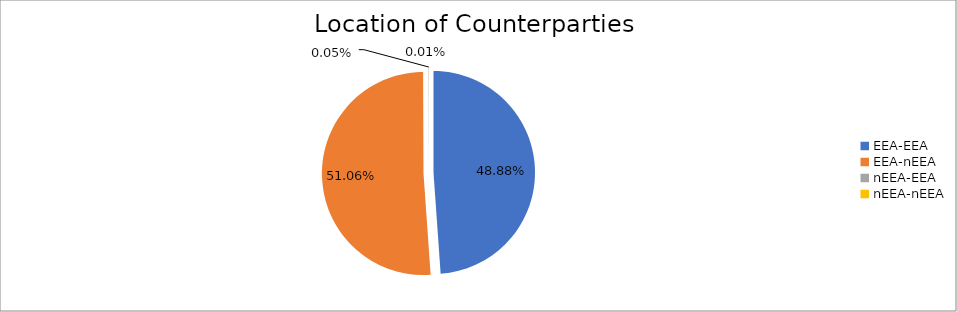
| Category | Series 0 |
|---|---|
| EEA-EEA | 5779902.241 |
| EEA-nEEA | 6037933.647 |
| nEEA-EEA | 6333.037 |
| nEEA-nEEA | 940.808 |